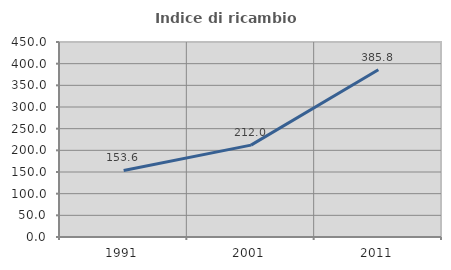
| Category | Indice di ricambio occupazionale  |
|---|---|
| 1991.0 | 153.554 |
| 2001.0 | 212.033 |
| 2011.0 | 385.794 |